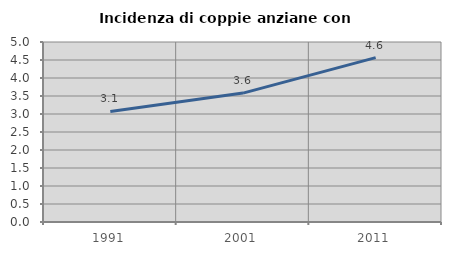
| Category | Incidenza di coppie anziane con figli |
|---|---|
| 1991.0 | 3.071 |
| 2001.0 | 3.581 |
| 2011.0 | 4.566 |